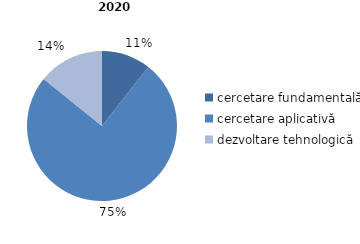
| Category | Series 0 |
|---|---|
| cercetare fundamentală | 10.6 |
| cercetare aplicativă | 75.2 |
| dezvoltare tehnologică  | 14.2 |